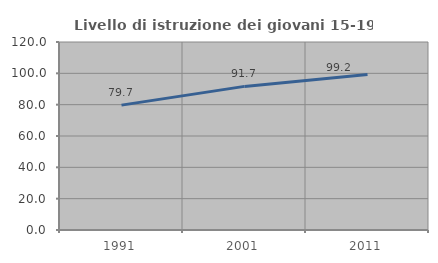
| Category | Livello di istruzione dei giovani 15-19 anni |
|---|---|
| 1991.0 | 79.706 |
| 2001.0 | 91.667 |
| 2011.0 | 99.203 |